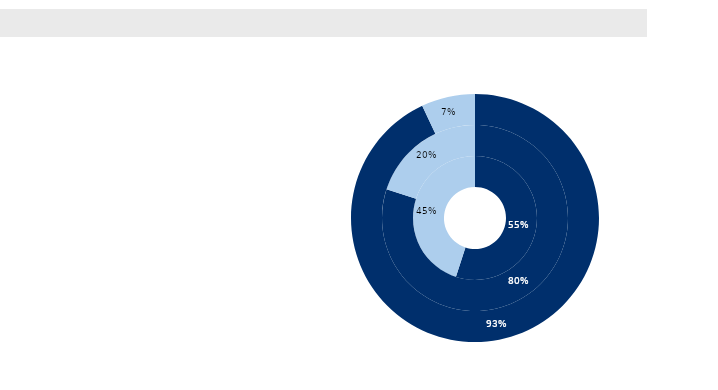
| Category | Regulations ban anonymous donations, and all contributions made to political parties and/or candidates must be registered and reported | Regulations ban contributions from publically owned enterprises | Parties and/or candidates must report their finances (funding and expenses) during electoral campaigns.	 |
|---|---|---|---|
| Sí | 0.55 | 0.8 | 0.93 |
| No | 0.45 | 0.2 | 0.07 |